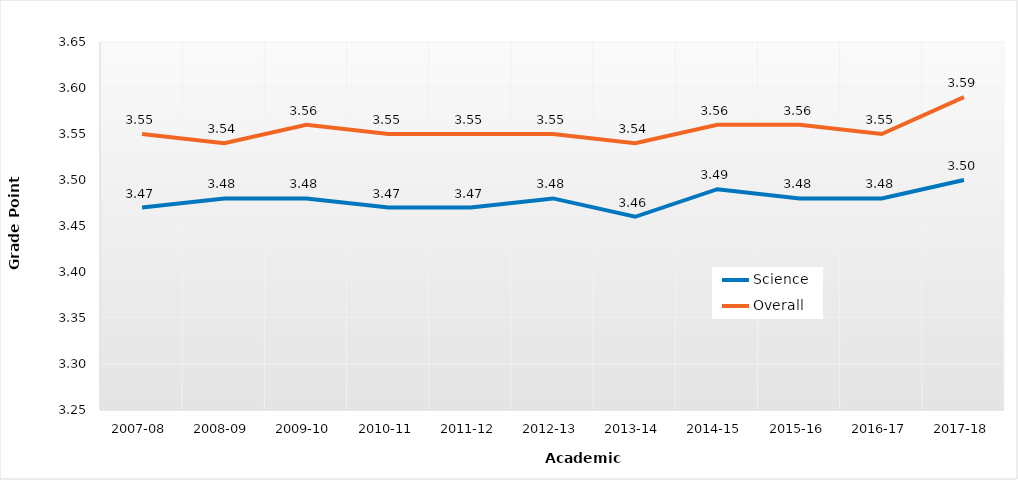
| Category | Science | Overall |
|---|---|---|
| 2007-08 | 3.47 | 3.55 |
| 2008-09 | 3.48 | 3.54 |
| 2009-10 | 3.48 | 3.56 |
| 2010-11 | 3.47 | 3.55 |
| 2011-12 | 3.47 | 3.55 |
| 2012-13 | 3.48 | 3.55 |
| 2013-14 | 3.46 | 3.54 |
| 2014-15 | 3.49 | 3.56 |
| 2015-16 | 3.48 | 3.56 |
| 2016-17 | 3.48 | 3.55 |
| 2017-18 | 3.5 | 3.59 |